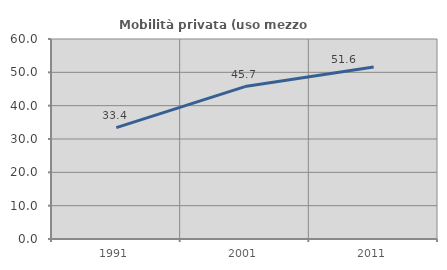
| Category | Mobilità privata (uso mezzo privato) |
|---|---|
| 1991.0 | 33.433 |
| 2001.0 | 45.726 |
| 2011.0 | 51.613 |